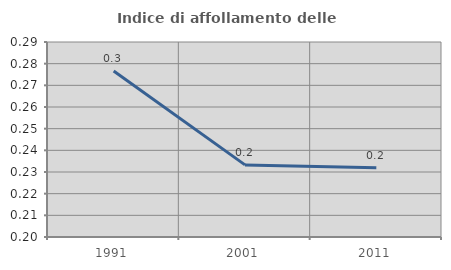
| Category | Indice di affollamento delle abitazioni  |
|---|---|
| 1991.0 | 0.277 |
| 2001.0 | 0.233 |
| 2011.0 | 0.232 |